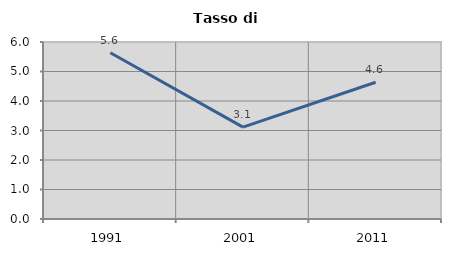
| Category | Tasso di disoccupazione   |
|---|---|
| 1991.0 | 5.634 |
| 2001.0 | 3.116 |
| 2011.0 | 4.635 |